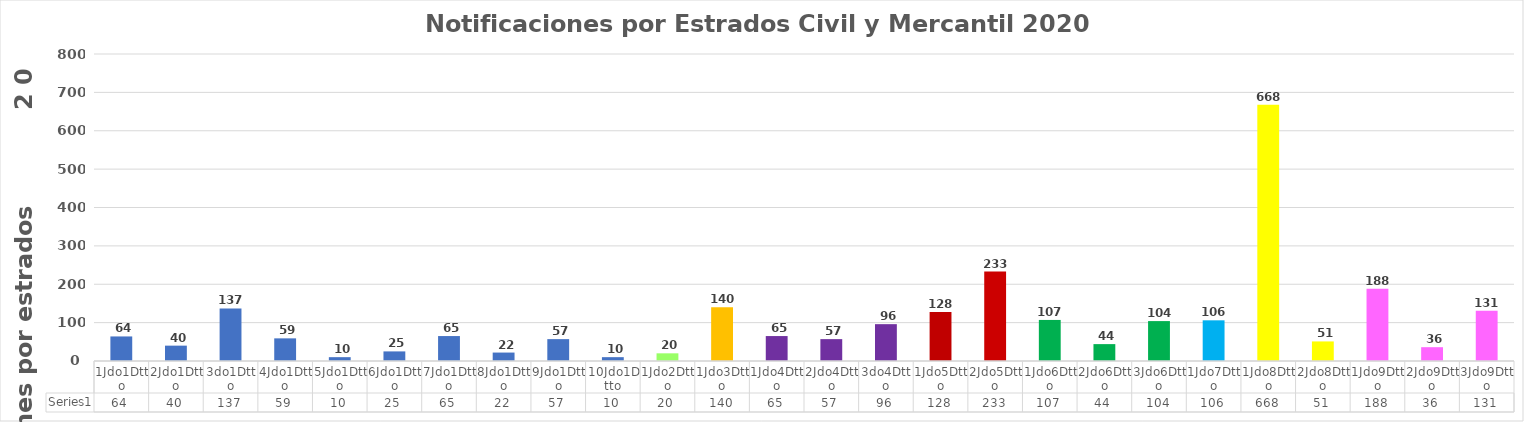
| Category | Series 0 |
|---|---|
| 1Jdo1Dtto | 64 |
| 2Jdo1Dtto | 40 |
| 3do1Dtto | 137 |
| 4Jdo1Dtto | 59 |
| 5Jdo1Dtto | 10 |
| 6Jdo1Dtto | 25 |
| 7Jdo1Dtto | 65 |
| 8Jdo1Dtto | 22 |
| 9Jdo1Dtto | 57 |
| 10Jdo1Dtto | 10 |
| 1Jdo2Dtto | 20 |
| 1Jdo3Dtto | 140 |
| 1Jdo4Dtto | 65 |
| 2Jdo4Dtto | 57 |
| 3do4Dtto | 96 |
| 1Jdo5Dtto | 128 |
| 2Jdo5Dtto | 233 |
| 1Jdo6Dtto | 107 |
| 2Jdo6Dtto | 44 |
| 3Jdo6Dtto | 104 |
| 1Jdo7Dtto | 106 |
| 1Jdo8Dtto | 668 |
| 2Jdo8Dtto | 51 |
| 1Jdo9Dtto | 188 |
| 2Jdo9Dtto | 36 |
| 3Jdo9Dtto | 131 |